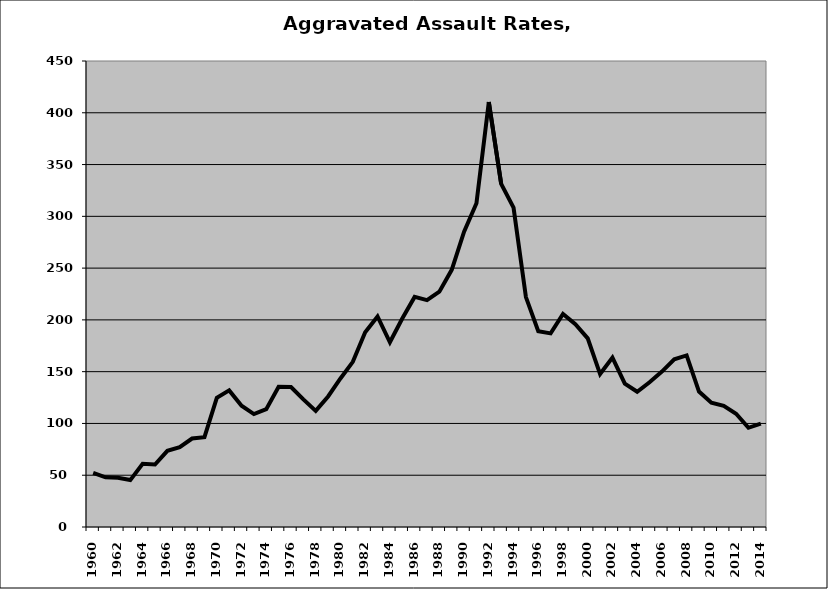
| Category | Aggravated Assault |
|---|---|
| 1960.0 | 52.269 |
| 1961.0 | 47.952 |
| 1962.0 | 47.469 |
| 1963.0 | 45.299 |
| 1964.0 | 61.032 |
| 1965.0 | 60.365 |
| 1966.0 | 73.547 |
| 1967.0 | 77.172 |
| 1968.0 | 85.413 |
| 1969.0 | 86.726 |
| 1970.0 | 124.716 |
| 1971.0 | 131.901 |
| 1972.0 | 117.066 |
| 1973.0 | 109.066 |
| 1974.0 | 113.732 |
| 1975.0 | 135.306 |
| 1976.0 | 135.123 |
| 1977.0 | 123.279 |
| 1978.0 | 112.093 |
| 1979.0 | 126.084 |
| 1980.0 | 143.458 |
| 1981.0 | 159.465 |
| 1982.0 | 187.974 |
| 1983.0 | 203.285 |
| 1984.0 | 178.378 |
| 1985.0 | 201.315 |
| 1986.0 | 222.183 |
| 1987.0 | 219.131 |
| 1988.0 | 227.251 |
| 1989.0 | 248.35 |
| 1990.0 | 285.16 |
| 1991.0 | 312.685 |
| 1992.0 | 410.36 |
| 1993.0 | 331.354 |
| 1994.0 | 308.388 |
| 1995.0 | 222.047 |
| 1996.0 | 189.161 |
| 1997.0 | 187.001 |
| 1998.0 | 205.716 |
| 1999.0 | 195.843 |
| 2000.0 | 182.173 |
| 2001.0 | 147.684 |
| 2002.0 | 163.626 |
| 2003.0 | 138.483 |
| 2004.0 | 130.618 |
| 2005.0 | 139.793 |
| 2006.0 | 150.116 |
| 2007.0 | 161.996 |
| 2008.0 | 165.674 |
| 2009.0 | 130.803 |
| 2010.0 | 120.11 |
| 2011.0 | 117.019 |
| 2012.0 | 109.413 |
| 2013.0 | 95.805 |
| 2014.0 | 99.786 |